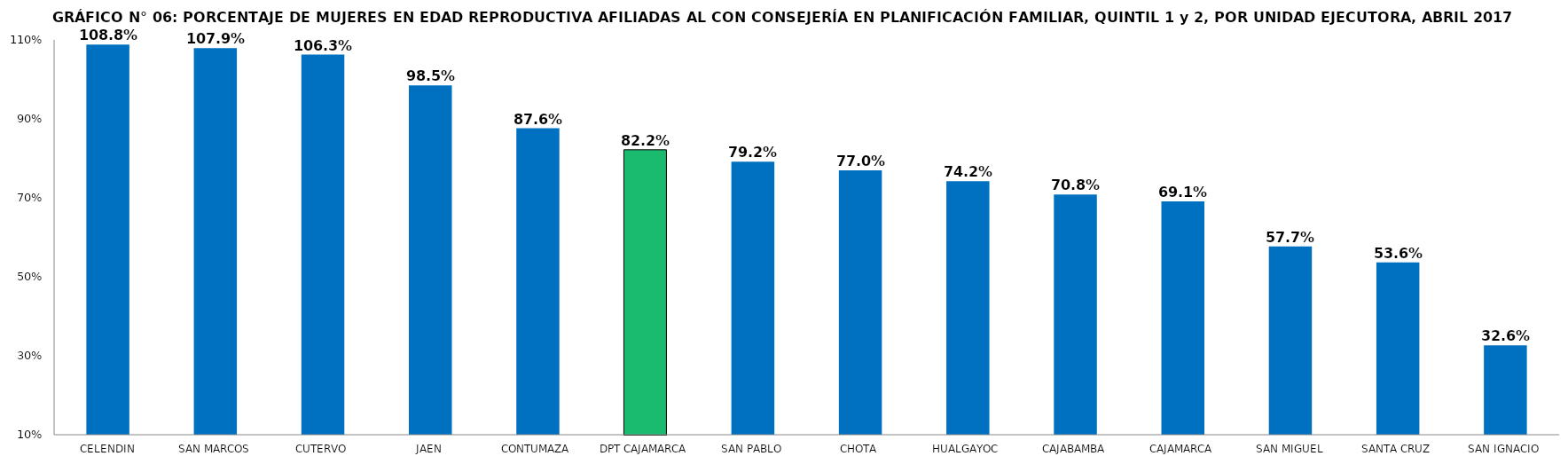
| Category | % AFILIADAS CON CONSEJERÍA EN PPFF 
(QUINTIL 1 y 2) |
|---|---|
| CELENDIN | 1.088 |
| SAN MARCOS | 1.079 |
| CUTERVO | 1.063 |
| JAEN | 0.985 |
| CONTUMAZA | 0.876 |
| DPT CAJAMARCA | 0.822 |
| SAN PABLO | 0.792 |
| CHOTA | 0.77 |
| HUALGAYOC | 0.742 |
| CAJABAMBA | 0.708 |
| CAJAMARCA | 0.691 |
| SAN MIGUEL | 0.577 |
| SANTA CRUZ | 0.536 |
| SAN IGNACIO | 0.326 |